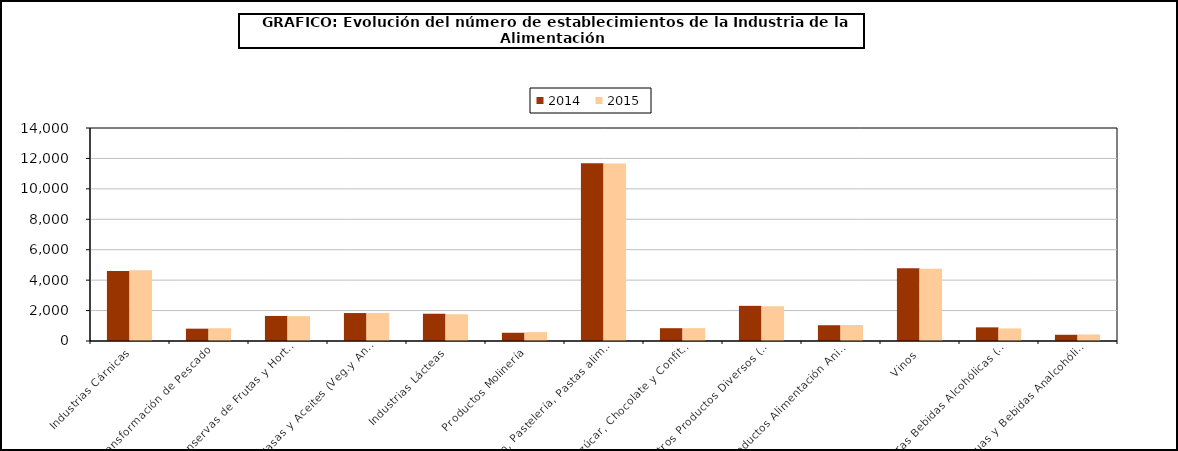
| Category | 2014 | 2015 |
|---|---|---|
| Industrias Cárnicas | 4604 | 4654 |
| Transformación de Pescado | 811 | 838 |
| Conservas de Frutas y Hortalizas   | 1648 | 1633 |
| Grasas y Aceites (Veg.y Anim.) | 1837 | 1845 |
| Industrias Lácteas | 1792 | 1759 |
| Productos Molinería | 541 | 583 |
| Pan, Pastelería, Pastas alimenticias | 11681 | 11662 |
| Azúcar, Chocolate y Confitería | 842 | 846 |
| Otros Productos Diversos (1) | 2311 | 2286 |
| Productos Alimentación Animal | 1037 | 1053 |
| Vinos | 4783 | 4747 |
| Otras Bebidas Alcohólicas (2) | 896 | 827 |
| Aguas y Bebidas Analcohólicas  | 410 | 430 |